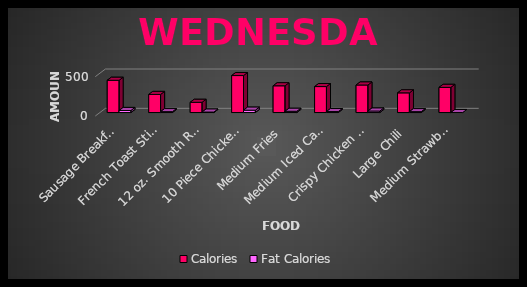
| Category | Calories | Fat Calories |
|---|---|---|
| Sausage Breakfast Burrito | 410 | 26 |
| French Toast Sticks | 230 | 11 |
| 12 oz. Smooth Roast Iced Coffee | 130 | 6 |
| 10 Piece Chicken Nugget | 470 | 30 |
| Medium Fries | 340 | 16 |
| Medium Iced Caramel Mocha | 330 | 12 |
| Crispy Chicken Sandwich | 350 | 19 |
| Large Chili | 250 | 11 |
| Medium Strawberry Lemonade | 320 | 0 |